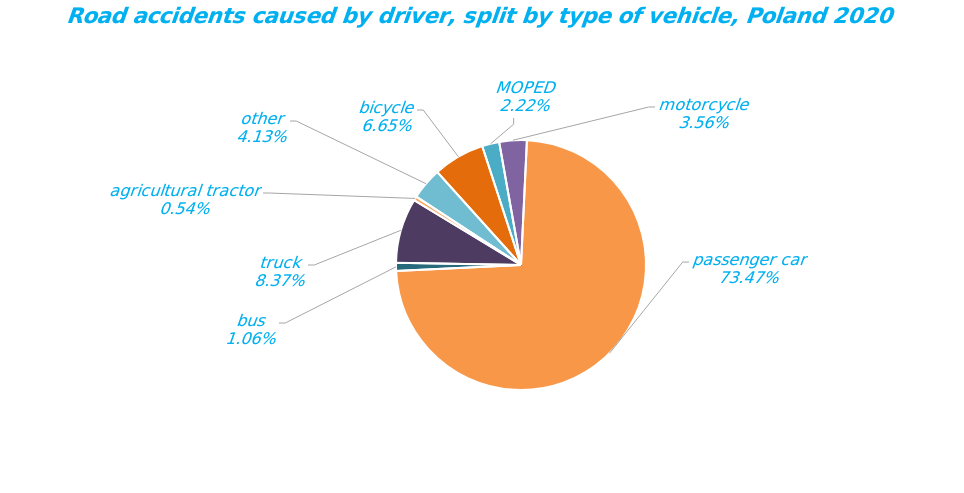
| Category | Series 0 |
|---|---|
| bicycle | 1396 |
| MOPED | 466 |
| motorcycle | 747 |
| passenger car | 15429 |
| bus | 223 |
| truck | 1758 |
| agricultural tractor | 113 |
| other | 867 |